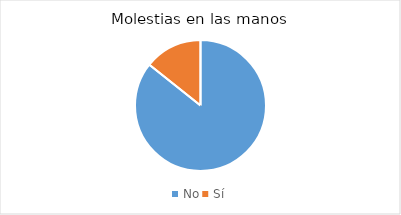
| Category | Series 0 |
|---|---|
| No | 6 |
| Sí | 1 |